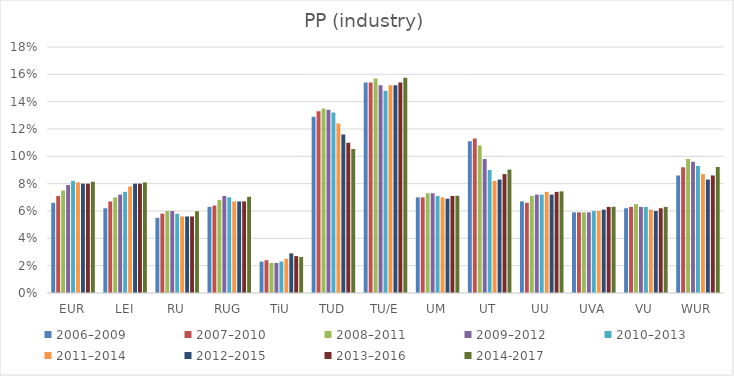
| Category | 2006–2009 | 2007–2010 | 2008–2011 | 2009–2012 | 2010–2013 | 2011–2014 | 2012–2015 | 2013–2016 | 2014-2017 |
|---|---|---|---|---|---|---|---|---|---|
| EUR | 6.6 | 7.1 | 7.5 | 7.9 | 8.2 | 8.1 | 8 | 8 | 8.14 |
| LEI | 6.2 | 6.7 | 7 | 7.2 | 7.4 | 7.8 | 8 | 8 | 8.093 |
| RU | 5.5 | 5.8 | 6 | 6 | 5.8 | 5.6 | 5.6 | 5.6 | 5.978 |
| RUG | 6.3 | 6.4 | 6.8 | 7.1 | 7 | 6.7 | 6.7 | 6.7 | 7.042 |
| TiU | 2.3 | 2.4 | 2.2 | 2.2 | 2.3 | 2.5 | 2.9 | 2.7 | 2.634 |
| TUD | 12.9 | 13.3 | 13.5 | 13.4 | 13.2 | 12.4 | 11.6 | 11 | 10.537 |
| TU/E | 15.4 | 15.4 | 15.7 | 15.2 | 14.8 | 15.2 | 15.2 | 15.4 | 15.756 |
| UM | 7 | 7 | 7.3 | 7.3 | 7.1 | 7 | 6.9 | 7.1 | 7.113 |
| UT | 11.1 | 11.3 | 10.8 | 9.8 | 9 | 8.2 | 8.3 | 8.7 | 9.032 |
| UU | 6.7 | 6.6 | 7.1 | 7.2 | 7.2 | 7.4 | 7.2 | 7.4 | 7.438 |
| UVA | 5.9 | 5.9 | 5.9 | 5.9 | 6 | 6 | 6.1 | 6.3 | 6.313 |
| VU | 6.2 | 6.3 | 6.5 | 6.3 | 6.3 | 6.1 | 6 | 6.2 | 6.298 |
| WUR | 8.6 | 9.2 | 9.8 | 9.6 | 9.3 | 8.7 | 8.3 | 8.6 | 9.218 |